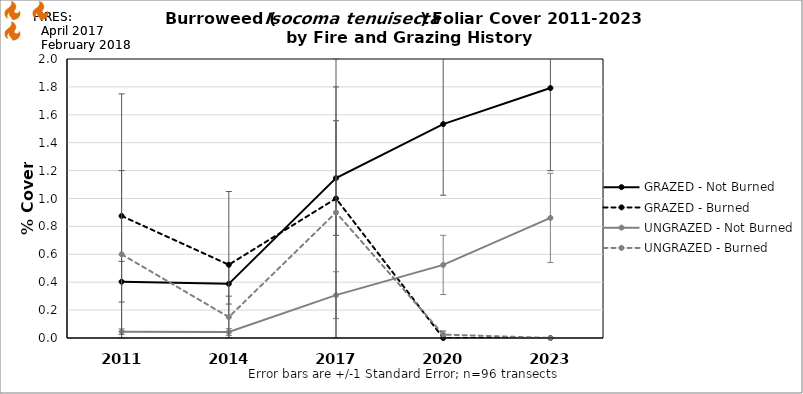
| Category | GRAZED - Not Burned | GRAZED - Burned | UNGRAZED - Not Burned | UNGRAZED - Burned |
|---|---|---|---|---|
| 2011.0 | 0.404 | 0.875 | 0.045 | 0.6 |
| 2014.0 | 0.388 | 0.525 | 0.043 | 0.15 |
| 2017.0 | 1.146 | 1 | 0.307 | 0.9 |
| 2020.0 | 1.533 | 0 | 0.524 | 0.025 |
| 2023.0 | 1.792 | 0 | 0.861 | 0 |